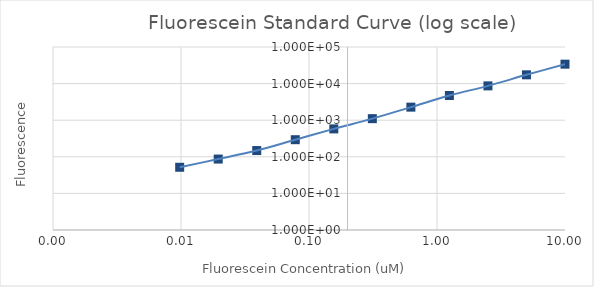
| Category | Series 1 |
|---|---|
| 10.0 | 33962 |
| 5.0 | 17370.75 |
| 2.5 | 8665.75 |
| 1.25 | 4728.25 |
| 0.625 | 2273.75 |
| 0.3125 | 1101.75 |
| 0.15625 | 579 |
| 0.078125 | 293.25 |
| 0.0390625 | 148.25 |
| 0.01953125 | 86.75 |
| 0.009765625 | 51.75 |